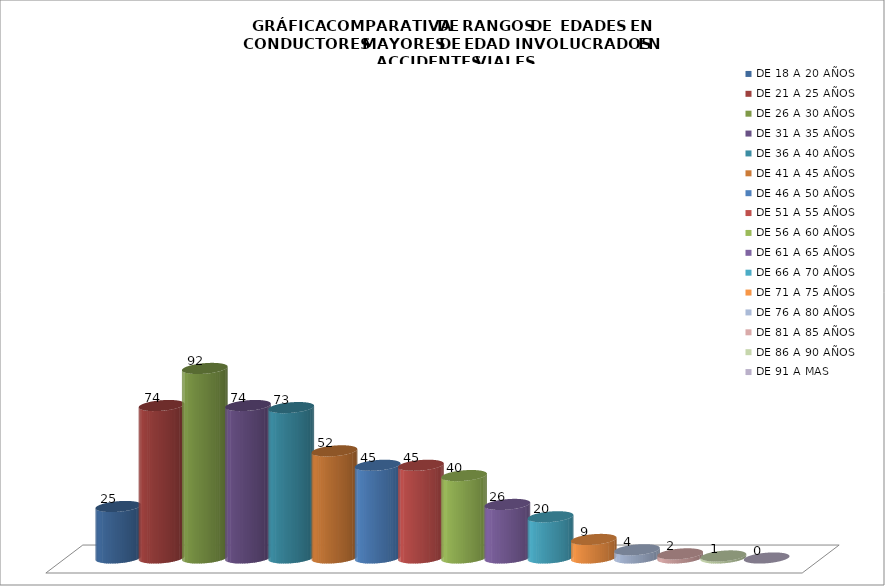
| Category | DE 18 A 20 AÑOS | DE 21 A 25 AÑOS | DE 26 A 30 AÑOS | DE 31 A 35 AÑOS | DE 36 A 40 AÑOS | DE 41 A 45 AÑOS | DE 46 A 50 AÑOS | DE 51 A 55 AÑOS | DE 56 A 60 AÑOS | DE 61 A 65 AÑOS | DE 66 A 70 AÑOS | DE 71 A 75 AÑOS | DE 76 A 80 AÑOS | DE 81 A 85 AÑOS | DE 86 A 90 AÑOS | DE 91 A MAS |
|---|---|---|---|---|---|---|---|---|---|---|---|---|---|---|---|---|
| 0 | 25 | 74 | 92 | 74 | 73 | 52 | 45 | 45 | 40 | 26 | 20 | 9 | 4 | 2 | 1 | 0 |